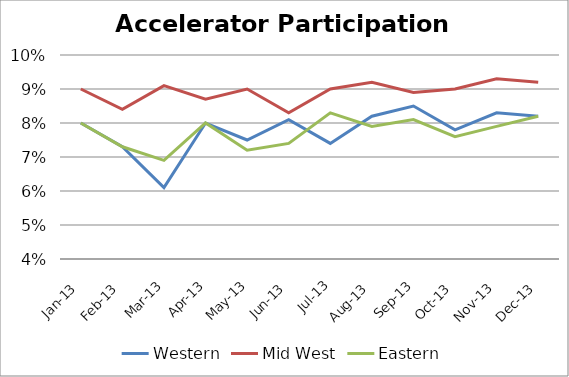
| Category | Western | Mid West | Eastern |
|---|---|---|---|
| 2013-01-31 | 0.08 | 0.09 | 0.08 |
| 2013-02-28 | 0.073 | 0.084 | 0.073 |
| 2013-03-31 | 0.061 | 0.091 | 0.069 |
| 2013-04-30 | 0.08 | 0.087 | 0.08 |
| 2013-05-31 | 0.075 | 0.09 | 0.072 |
| 2013-06-30 | 0.081 | 0.083 | 0.074 |
| 2013-07-31 | 0.074 | 0.09 | 0.083 |
| 2013-08-31 | 0.082 | 0.092 | 0.079 |
| 2013-09-30 | 0.085 | 0.089 | 0.081 |
| 2013-10-31 | 0.078 | 0.09 | 0.076 |
| 2013-11-30 | 0.083 | 0.093 | 0.079 |
| 2013-12-31 | 0.082 | 0.092 | 0.082 |